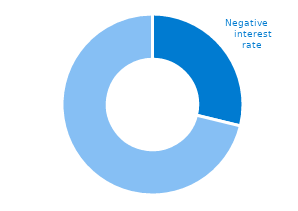
| Category | Series 0 |
|---|---|
| Negativ rente | 28.8 |
| Positiv rente | 71.2 |